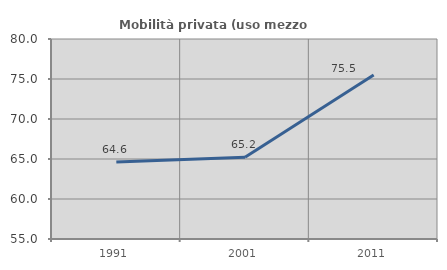
| Category | Mobilità privata (uso mezzo privato) |
|---|---|
| 1991.0 | 64.628 |
| 2001.0 | 65.224 |
| 2011.0 | 75.492 |